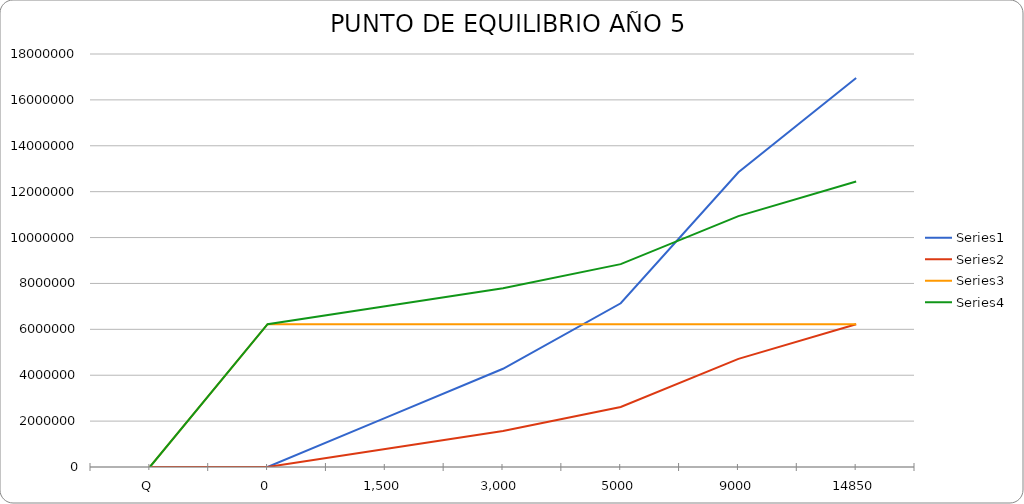
| Category | Series 0 | Series 1 | Series 2 | Series 3 |
|---|---|---|---|---|
| Q | 0 | 0 | 0 | 0 |
| 0 | 0 | 0 | 6224128.362 | 6224128.362 |
| 1.500 | 2140909.091 | 785356.39 | 6224128.362 | 7009484.751 |
| 3.000 | 4281818.182 | 1570712.779 | 6224128.362 | 7794841.141 |
| 5000 | 7136363.636 | 2617854.632 | 6224128.362 | 8841982.994 |
| 9000 | 12845454.545 | 4712138.338 | 6224128.362 | 10936266.7 |
| 14850 | 16956000 | 6220022.607 | 6224128.362 | 12444150.968 |